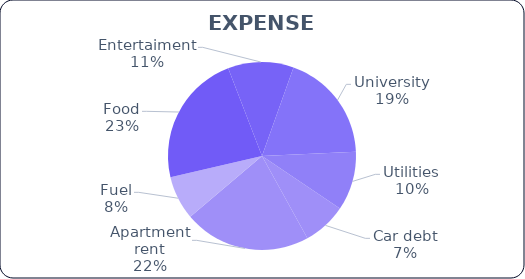
| Category | Actual |
|---|---|
| Car debt | 200 |
| Apartment rent | 580 |
| Fuel | 200 |
| Food | 605 |
| Entertaiment | 300 |
| University | 500 |
| Utilities | 270 |